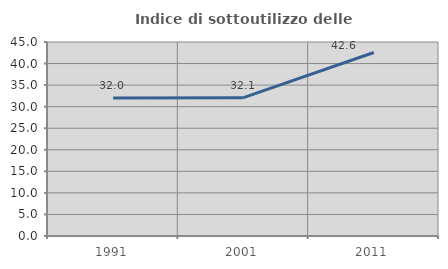
| Category | Indice di sottoutilizzo delle abitazioni  |
|---|---|
| 1991.0 | 32.02 |
| 2001.0 | 32.095 |
| 2011.0 | 42.563 |